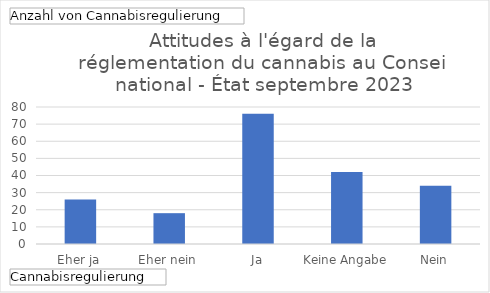
| Category | Ergebnis |
|---|---|
| Eher ja | 26 |
| Eher nein | 18 |
| Ja | 76 |
| Keine Angabe | 42 |
| Nein | 34 |